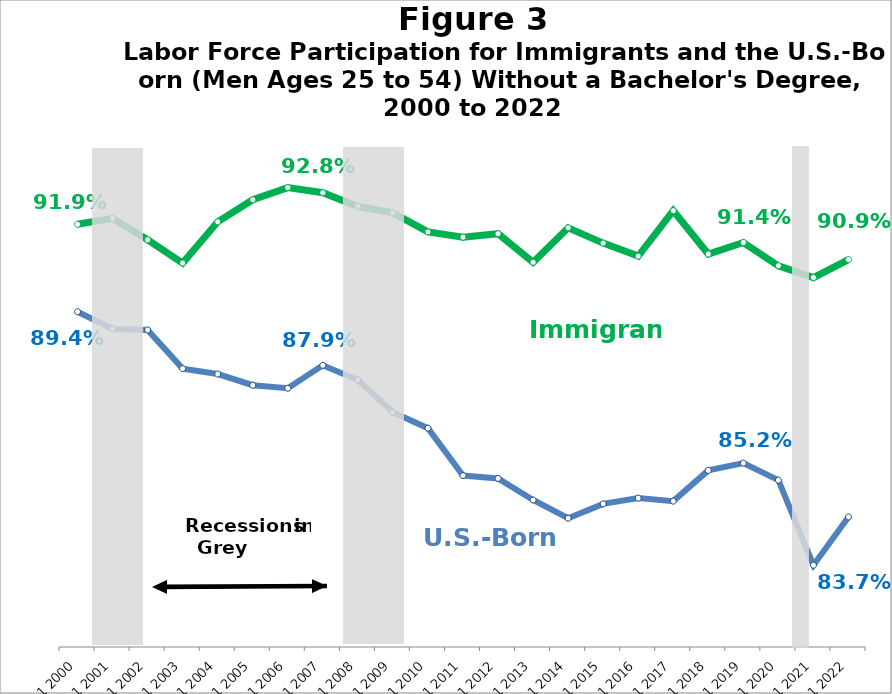
| Category | Native | Immigrant |
|---|---|---|
| Q1 2000 | 0.894 | 0.919 |
| Q1 2001 | 0.89 | 0.921 |
| Q1 2002 | 0.889 | 0.915 |
| Q1 2003 | 0.878 | 0.908 |
| Q1 2004 | 0.877 | 0.92 |
| Q1 2005 | 0.874 | 0.926 |
| Q1 2006 | 0.873 | 0.929 |
| Q1 2007 | 0.879 | 0.928 |
| Q1 2008 | 0.875 | 0.924 |
| Q1 2009 | 0.866 | 0.922 |
| Q1 2010 | 0.862 | 0.917 |
| Q1 2011 | 0.848 | 0.915 |
| Q1 2012 | 0.847 | 0.916 |
| Q1 2013 | 0.841 | 0.908 |
| Q1 2014 | 0.836 | 0.918 |
| Q1 2015 | 0.84 | 0.914 |
| Q1 2016 | 0.842 | 0.91 |
| Q1 2017 | 0.841 | 0.923 |
| Q1 2018 | 0.85 | 0.911 |
| Q1 2019 | 0.852 | 0.914 |
| Q1 2020 | 0.847 | 0.907 |
| Q1 2021 | 0.823 | 0.904 |
| Q1 2022 | 0.837 | 0.909 |